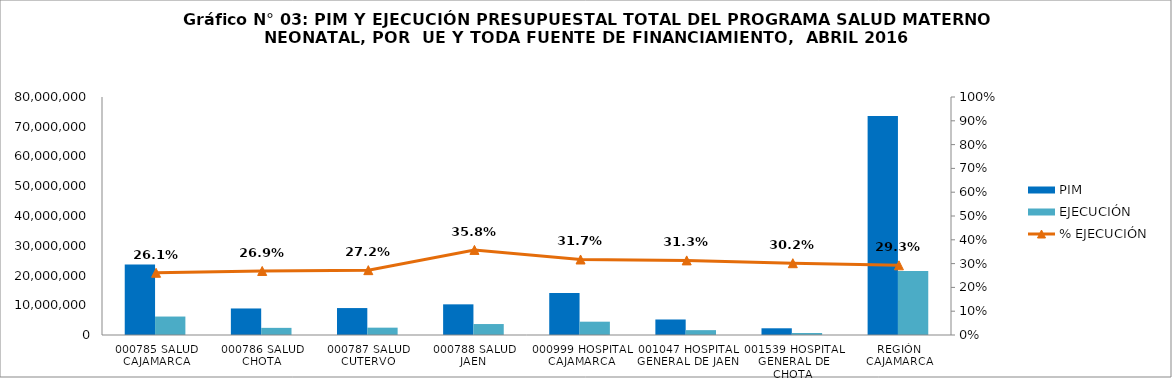
| Category | PIM  | EJECUCIÓN  |
|---|---|---|
| 000785 SALUD CAJAMARCA | 23731866 | 6204701 |
| 000786 SALUD CHOTA | 8918872 | 2399276 |
| 000787 SALUD CUTERVO | 9054745 | 2467034 |
| 000788 SALUD JAEN | 10306140 | 3684561 |
| 000999 HOSPITAL CAJAMARCA | 14106511 | 4475750 |
| 001047 HOSPITAL GENERAL DE JAEN | 5214423 | 1634381 |
| 001539 HOSPITAL GENERAL DE CHOTA | 2256788 | 680674 |
| REGIÓN CAJAMARCA | 73589345 | 21546377 |